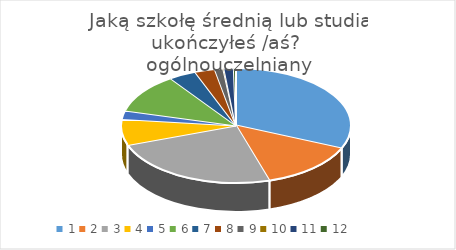
| Category | Series 0 |
|---|---|
| 0 | 212 |
| 1 | 93 |
| 2 | 163 |
| 3 | 49 |
| 4 | 16 |
| 5 | 75 |
| 6 | 26 |
| 7 | 19 |
| 8 | 8 |
| 9 | 1 |
| 10 | 9 |
| 11 | 2 |